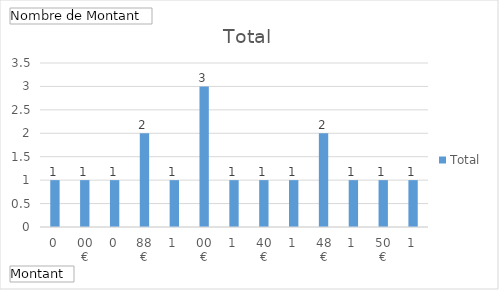
| Category | Total |
|---|---|
| 0,00 € | 1 |
| 0,88 € | 1 |
| 1,00 € | 1 |
| 1,40 € | 2 |
| 1,48 € | 1 |
| 1,50 € | 3 |
| 1,52 € | 1 |
| 1,61 € | 1 |
| 2,00 € | 1 |
| 2,06 € | 2 |
| 2,10 € | 1 |
| 2,30 € | 1 |
| 5,00 € | 1 |